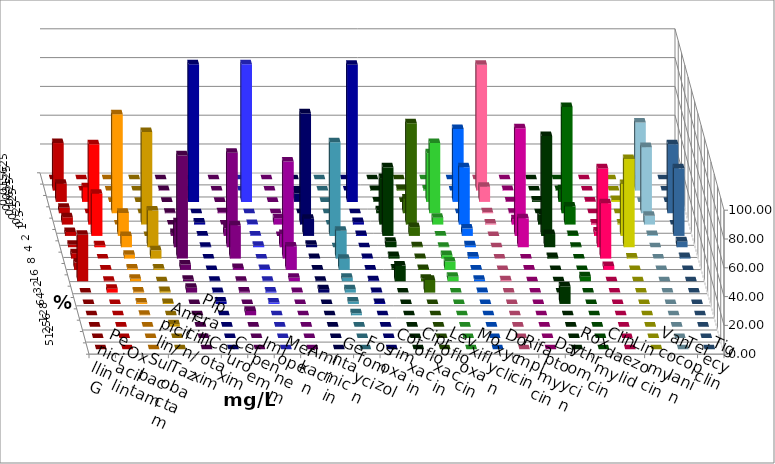
| Category | Penicillin G | Oxacillin | Ampicillin/ Sulbactam | Piperacillin/ Tazobactam | Cefotaxim | Cefuroxim | Imipenem | Meropenem | Amikacin | Gentamicin | Fosfomycin | Cotrimoxazol | Ciprofloxacin | Levofloxacin | Moxifloxacin | Doxycyclin | Rifampicin | Daptomycin | Roxythromycin | Clindamycin | Linezolid | Vancomycin | Teicoplanin | Tigecyclin |
|---|---|---|---|---|---|---|---|---|---|---|---|---|---|---|---|---|---|---|---|---|---|---|---|---|
| 0.015625 | 0 | 0 | 0 | 0 | 0 | 0 | 0 | 0 | 0 | 0 | 0 | 0 | 0 | 0 | 0 | 0 | 0 | 0 | 0 | 0 | 0 | 0 | 0 | 0 |
| 0.03125 | 32.993 | 0 | 0 | 0 | 0.341 | 0 | 0 | 0 | 0 | 0 | 0 | 0 | 0.34 | 1.02 | 0.683 | 0 | 87.415 | 0.34 | 0 | 0.34 | 0 | 0 | 0 | 47.279 |
| 0.0625 | 12.585 | 10.204 | 0 | 0 | 0 | 0 | 95.578 | 95.578 | 0 | 5.782 | 0 | 95.238 | 0.34 | 0 | 33.788 | 50.68 | 10.544 | 0.34 | 1.02 | 8.844 | 0.34 | 1.361 | 0 | 0 |
| 0.125 | 3.741 | 0 | 68.707 | 0 | 0.341 | 0.68 | 0 | 0 | 0 | 0 | 0 | 0 | 2.041 | 10.204 | 48.805 | 0 | 0.68 | 0.34 | 0 | 73.81 | 0 | 0 | 47.959 | 45.918 |
| 0.25 | 5.102 | 55.782 | 0 | 64.286 | 0 | 0 | 1.361 | 0.34 | 4.422 | 77.211 | 0 | 1.701 | 32.313 | 70.408 | 4.778 | 39.796 | 0.68 | 3.741 | 7.143 | 12.585 | 0.68 | 0.68 | 0 | 6.122 |
| 0.5 | 2.721 | 29.252 | 15.986 | 0 | 2.048 | 5.102 | 0.34 | 0.34 | 0 | 11.905 | 64.966 | 0.68 | 47.619 | 6.122 | 0.341 | 5.102 | 0 | 74.83 | 69.388 | 0.68 | 3.061 | 36.054 | 46.939 | 0.68 |
| 1.0 | 1.701 | 1.361 | 7.823 | 25.51 | 17.406 | 65.646 | 0.34 | 1.02 | 9.184 | 1.701 | 0 | 0 | 3.741 | 0.68 | 0.341 | 1.361 | 0 | 20.068 | 9.184 | 0.34 | 54.762 | 61.224 | 4.082 | 0 |
| 2.0 | 3.741 | 0 | 2.721 | 5.782 | 71.672 | 23.129 | 0 | 0 | 67.347 | 0.34 | 19.388 | 0.34 | 1.701 | 0.34 | 2.389 | 1.361 | 0 | 0 | 1.02 | 0 | 38.435 | 0.68 | 1.02 | 0 |
| 4.0 | 5.102 | 0.34 | 1.02 | 1.02 | 3.754 | 1.361 | 0 | 0.68 | 16.327 | 0.34 | 7.823 | 0.34 | 1.02 | 0.68 | 5.802 | 0.34 | 0 | 0.34 | 0 | 0 | 2.721 | 0 | 0 | 0 |
| 8.0 | 32.313 | 0.34 | 1.701 | 0 | 1.024 | 0.34 | 0.34 | 0.34 | 2.381 | 0.34 | 2.381 | 0.68 | 10.884 | 1.701 | 3.072 | 1.02 | 0.68 | 0 | 0 | 3.401 | 0 | 0 | 0 | 0 |
| 16.0 | 0 | 2.721 | 0.68 | 1.02 | 3.413 | 0.68 | 0.34 | 0.68 | 0.34 | 2.381 | 2.381 | 0.34 | 0 | 8.844 | 0 | 0.34 | 0 | 0 | 0 | 0 | 0 | 0 | 0 | 0 |
| 32.0 | 0 | 0 | 1.02 | 0.68 | 0 | 0 | 1.701 | 1.02 | 0 | 0 | 1.701 | 0.68 | 0 | 0 | 0 | 0 | 0 | 0 | 12.245 | 0 | 0 | 0 | 0 | 0 |
| 64.0 | 0 | 0 | 0.34 | 0 | 0 | 3.061 | 0 | 0 | 0 | 0 | 1.361 | 0 | 0 | 0 | 0 | 0 | 0 | 0 | 0 | 0 | 0 | 0 | 0 | 0 |
| 128.0 | 0 | 0 | 0 | 1.701 | 0 | 0 | 0 | 0 | 0 | 0 | 0 | 0 | 0 | 0 | 0 | 0 | 0 | 0 | 0 | 0 | 0 | 0 | 0 | 0 |
| 256.0 | 0 | 0 | 0 | 0 | 0 | 0 | 0 | 0 | 0 | 0 | 0 | 0 | 0 | 0 | 0 | 0 | 0 | 0 | 0 | 0 | 0 | 0 | 0 | 0 |
| 512.0 | 0 | 0 | 0 | 0 | 0 | 0 | 0 | 0 | 0 | 0 | 0 | 0 | 0 | 0 | 0 | 0 | 0 | 0 | 0 | 0 | 0 | 0 | 0 | 0 |